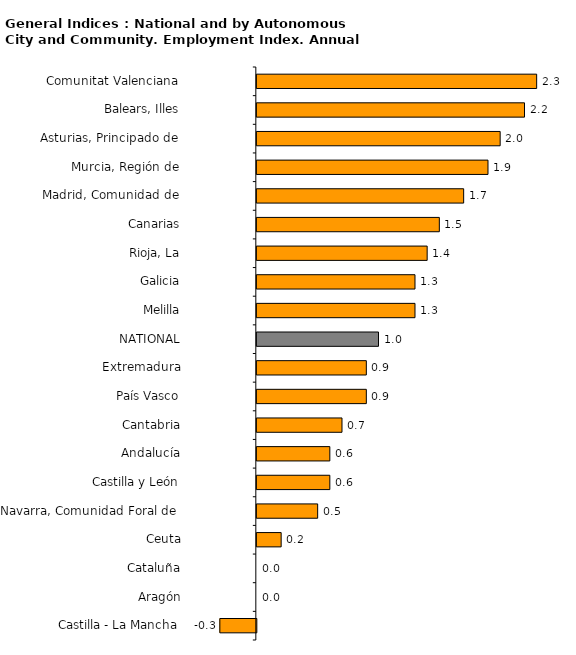
| Category | Series 0 |
|---|---|
| Castilla - La Mancha | -0.3 |
| Aragón | 0 |
| Cataluña | 0 |
| Ceuta | 0.2 |
| Navarra, Comunidad Foral de | 0.5 |
| Castilla y León | 0.6 |
| Andalucía | 0.6 |
| Cantabria | 0.7 |
| País Vasco | 0.9 |
| Extremadura | 0.9 |
| NATIONAL | 1 |
| Melilla | 1.3 |
| Galicia | 1.3 |
| Rioja, La | 1.4 |
| Canarias | 1.5 |
| Madrid, Comunidad de | 1.7 |
| Murcia, Región de | 1.9 |
| Asturias, Principado de | 2 |
| Balears, Illes | 2.2 |
| Comunitat Valenciana | 2.3 |